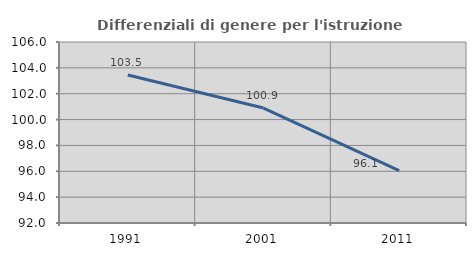
| Category | Differenziali di genere per l'istruzione superiore |
|---|---|
| 1991.0 | 103.451 |
| 2001.0 | 100.892 |
| 2011.0 | 96.059 |